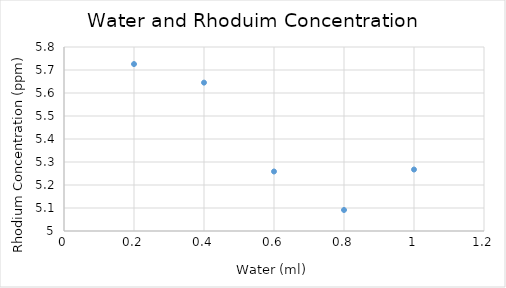
| Category | Series 0 |
|---|---|
| 1.0 | 5.267 |
| 0.8 | 5.091 |
| 0.6 | 5.259 |
| 0.4 | 5.645 |
| 0.2 | 5.726 |